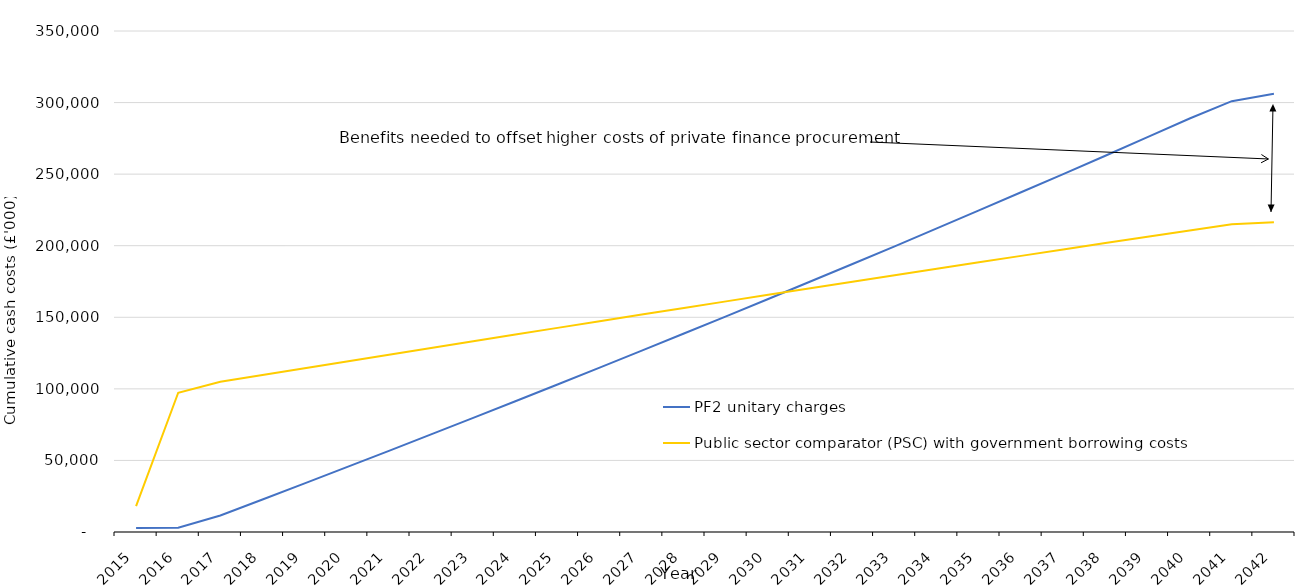
| Category | PF2 unitary charges | Public sector comparator (PSC) with government borrowing costs |
|---|---|---|
| 2015.0 | 2790.307 | 18131.407 |
| 2016.0 | 3003.672 | 97295.96 |
| 2017.0 | 11497.17 | 104943.791 |
| 2018.0 | 22679.405 | 109693.68 |
| 2019.0 | 33951.39 | 114431.967 |
| 2020.0 | 45289.82 | 119158.363 |
| 2021.0 | 56699.863 | 123872.57 |
| 2022.0 | 68185.078 | 128574.285 |
| 2023.0 | 79733.833 | 133263.194 |
| 2024.0 | 91372.659 | 137938.978 |
| 2025.0 | 103059.254 | 142601.308 |
| 2026.0 | 114865.192 | 147249.848 |
| 2027.0 | 126719.331 | 151884.253 |
| 2028.0 | 138681.562 | 156504.17 |
| 2029.0 | 150681.782 | 161109.237 |
| 2030.0 | 162781.811 | 165699.082 |
| 2031.0 | 175003.171 | 170273.325 |
| 2032.0 | 187256.964 | 174831.576 |
| 2033.0 | 199592.144 | 179373.435 |
| 2034.0 | 212058.985 | 183898.492 |
| 2035.0 | 224674.989 | 188406.328 |
| 2036.0 | 237337.125 | 192896.511 |
| 2037.0 | 250026.211 | 197368.6 |
| 2038.0 | 262867.015 | 201822.143 |
| 2039.0 | 275881.904 | 206256.677 |
| 2040.0 | 288897.63 | 210671.726 |
| 2041.0 | 300965.996 | 215066.803 |
| 2042.0 | 306188.462 | 216370.921 |